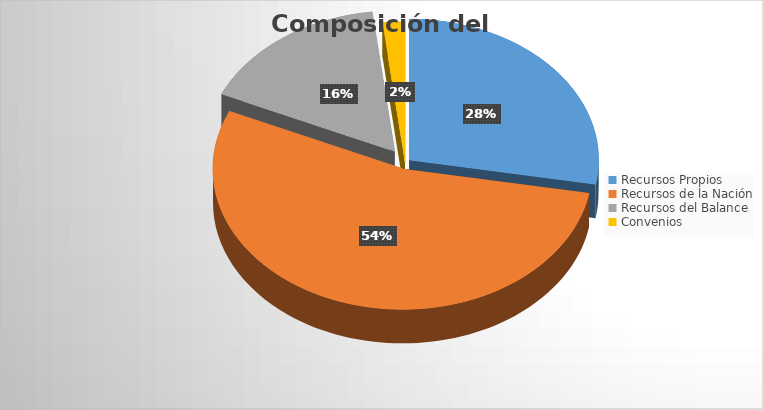
| Category | Series 0 |
|---|---|
| Recursos Propios | 54287731815.046 |
| Recursos de la Nación | 105357143565.19 |
| Recursos del Balance | 32095283336.71 |
| Convenios | 3700626780 |